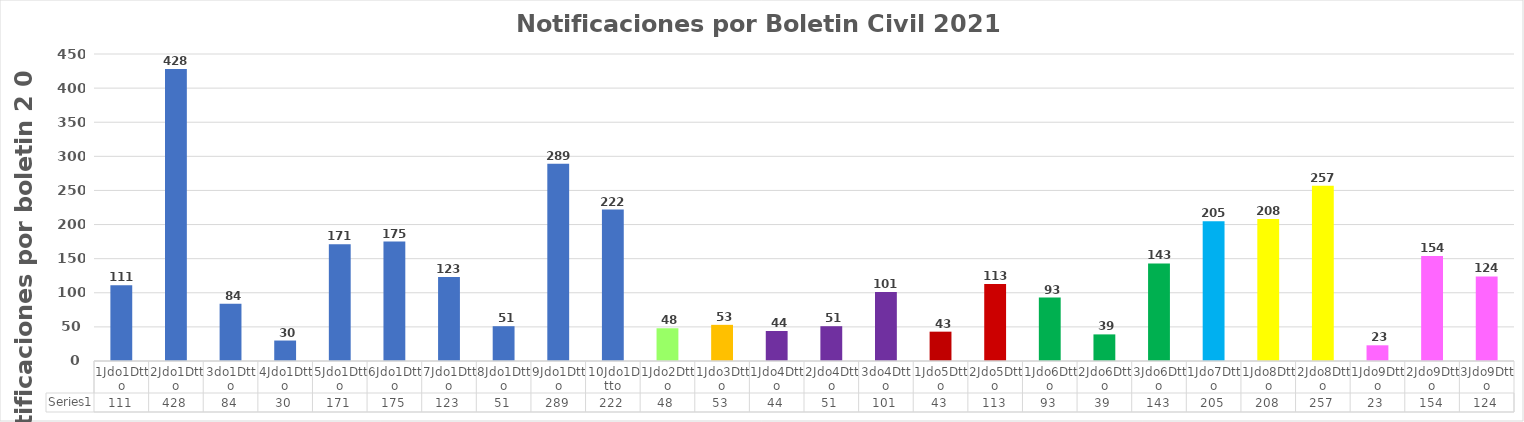
| Category | Series 0 |
|---|---|
| 1Jdo1Dtto | 111 |
| 2Jdo1Dtto | 428 |
| 3do1Dtto | 84 |
| 4Jdo1Dtto | 30 |
| 5Jdo1Dtto | 171 |
| 6Jdo1Dtto | 175 |
| 7Jdo1Dtto | 123 |
| 8Jdo1Dtto | 51 |
| 9Jdo1Dtto | 289 |
| 10Jdo1Dtto | 222 |
| 1Jdo2Dtto | 48 |
| 1Jdo3Dtto | 53 |
| 1Jdo4Dtto | 44 |
| 2Jdo4Dtto | 51 |
| 3do4Dtto | 101 |
| 1Jdo5Dtto | 43 |
| 2Jdo5Dtto | 113 |
| 1Jdo6Dtto | 93 |
| 2Jdo6Dtto | 39 |
| 3Jdo6Dtto | 143 |
| 1Jdo7Dtto | 205 |
| 1Jdo8Dtto | 208 |
| 2Jdo8Dtto | 257 |
| 1Jdo9Dtto | 23 |
| 2Jdo9Dtto | 154 |
| 3Jdo9Dtto | 124 |